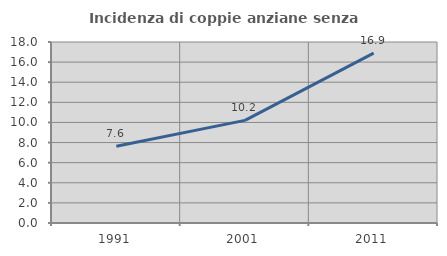
| Category | Incidenza di coppie anziane senza figli  |
|---|---|
| 1991.0 | 7.642 |
| 2001.0 | 10.204 |
| 2011.0 | 16.901 |